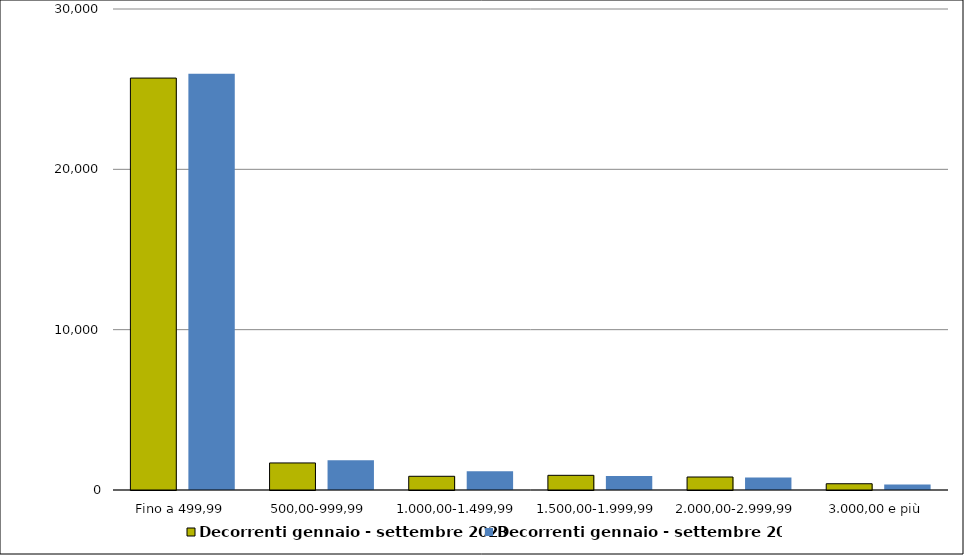
| Category | Decorrenti gennaio - settembre 2023 | Decorrenti gennaio - settembre 2022 |
|---|---|---|
|  Fino a 499,99  | 25692 | 25964 |
|  500,00-999,99  | 1687 | 1858 |
|  1.000,00-1.499,99  | 855 | 1164 |
|  1.500,00-1.999,99  | 916 | 867 |
|  2.000,00-2.999,99  | 810 | 783 |
|  3.000,00 e più  | 390 | 348 |